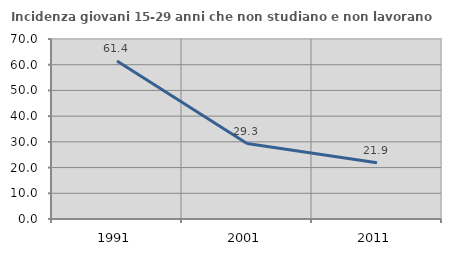
| Category | Incidenza giovani 15-29 anni che non studiano e non lavorano  |
|---|---|
| 1991.0 | 61.423 |
| 2001.0 | 29.323 |
| 2011.0 | 21.906 |